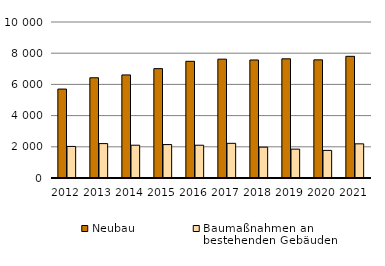
| Category | Neubau | Baumaßnahmen an 
bestehenden Gebäuden |
|---|---|---|
| 2012.0 | 5701 | 2024 |
| 2013.0 | 6425 | 2205 |
| 2014.0 | 6607 | 2102 |
| 2015.0 | 7011 | 2143 |
| 2016.0 | 7480 | 2101 |
| 2017.0 | 7618 | 2222 |
| 2018.0 | 7565 | 1977 |
| 2019.0 | 7639 | 1849 |
| 2020.0 | 7573 | 1769 |
| 2021.0 | 7800 | 2190 |